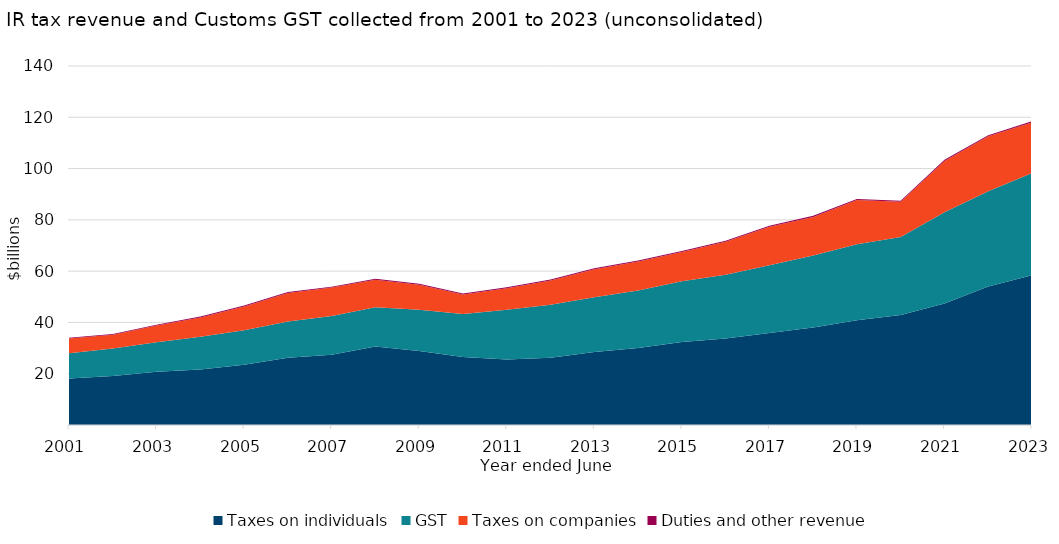
| Category | Taxes on individuals | GST | Taxes on companies | Duties and other revenue |
|---|---|---|---|---|
| 2001.0 | 18116.915 | 9886.366 | 5745.179 | 268.362 |
| 2002.0 | 19143.41 | 10644.756 | 5412.4 | 302.117 |
| 2003.0 | 20780.113 | 11525.947 | 6469.137 | 327.436 |
| 2004.0 | 21673.336 | 12775.925 | 7502.262 | 353.323 |
| 2005.0 | 23492.497 | 13430.639 | 9288.079 | 383.408 |
| 2006.0 | 26251.041 | 14133.382 | 11126.781 | 400.338 |
| 2007.0 | 27427.041 | 15105.456 | 11049.475 | 380.325 |
| 2008.0 | 30590.905 | 15299.618 | 10749.754 | 426.572 |
| 2009.0 | 28809.258 | 16106.996 | 9820.51 | 364.474 |
| 2010.0 | 26555.321 | 16727.273 | 7642.014 | 359.104 |
| 2011.0 | 25521.6 | 19461.443 | 8389.25 | 358.9 |
| 2012.0 | 26268.5 | 20646.154 | 9413.4 | 364.4 |
| 2013.0 | 28444.6 | 21356.182 | 10963.581 | 354.222 |
| 2014.0 | 30067.8 | 22416.575 | 11306.8 | 362.3 |
| 2015.0 | 32374.9 | 23677.624 | 11393.4 | 367.4 |
| 2016.0 | 33714.962 | 24901.546 | 12884.411 | 361.902 |
| 2017.0 | 35864.307 | 26390.746 | 15075.183 | 384.144 |
| 2018.0 | 38023.9 | 28108.888 | 15004.8 | 425.6 |
| 2019.0 | 40853 | 29650.711 | 17212.7 | 420.797 |
| 2020.0 | 42905.33 | 30398.616 | 13740.836 | 379.217 |
| 2021.0 | 47341.731 | 35627.691 | 20022.706 | 411.169 |
| 2022.0 | 54052.815 | 37093.677 | 21485.742 | 370.01 |
| 2023.0 | 58371.896 | 39893.737 | 19737.203 | 495.352 |